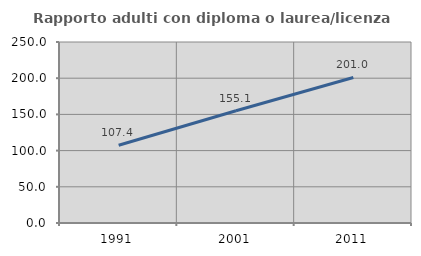
| Category | Rapporto adulti con diploma o laurea/licenza media  |
|---|---|
| 1991.0 | 107.438 |
| 2001.0 | 155.113 |
| 2011.0 | 200.99 |